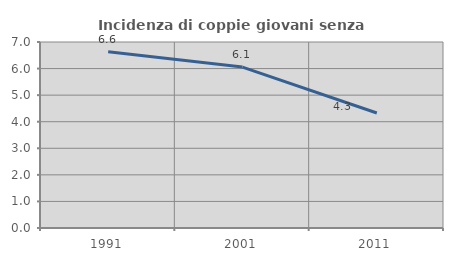
| Category | Incidenza di coppie giovani senza figli |
|---|---|
| 1991.0 | 6.63 |
| 2001.0 | 6.055 |
| 2011.0 | 4.327 |